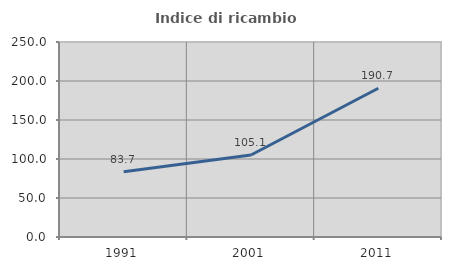
| Category | Indice di ricambio occupazionale  |
|---|---|
| 1991.0 | 83.721 |
| 2001.0 | 105.114 |
| 2011.0 | 190.698 |